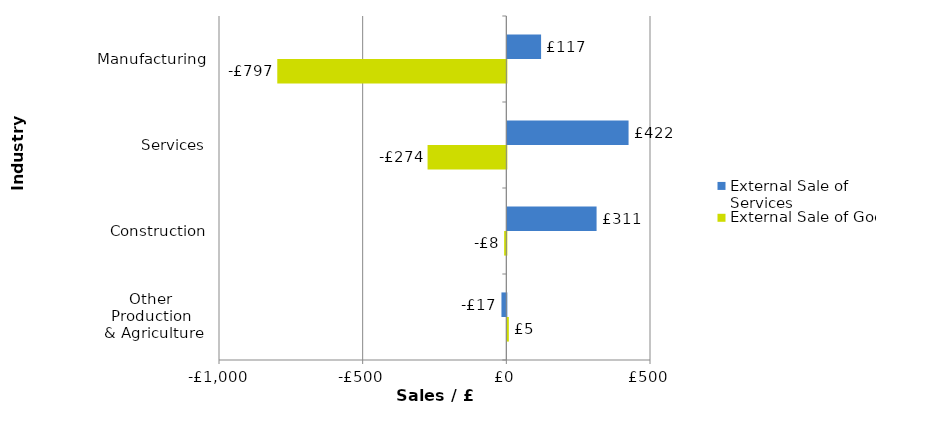
| Category | External Sale of Goods | External Sale of Services |
|---|---|---|
| Other 
Production 
& Agriculture
 | 5.179 | -17 |
| Construction | -7.598 | 310.604 |
| Services | -274.139 | 421.921 |
| Manufacturing | -797.18 | 117.462 |